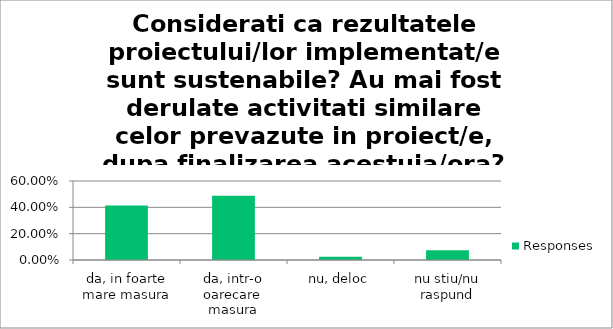
| Category | Responses |
|---|---|
| da, in foarte mare masura | 0.415 |
| da, intr-o oarecare masura | 0.488 |
| nu, deloc | 0.024 |
| nu stiu/nu raspund | 0.073 |